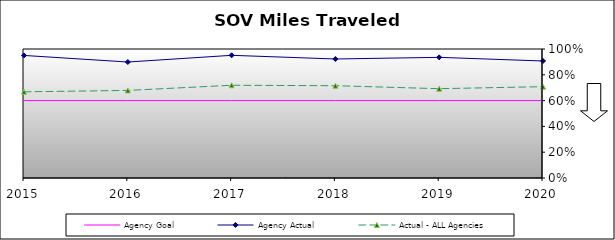
| Category | Agency Goal | Agency Actual | Actual - ALL Agencies |
|---|---|---|---|
| 2015.0 | 0.6 | 0.95 | 0.668 |
| 2016.0 | 0.6 | 0.899 | 0.679 |
| 2017.0 | 0.6 | 0.951 | 0.719 |
| 2018.0 | 0.6 | 0.922 | 0.715 |
| 2019.0 | 0.6 | 0.935 | 0.692 |
| 2020.0 | 0.6 | 0.907 | 0.708 |